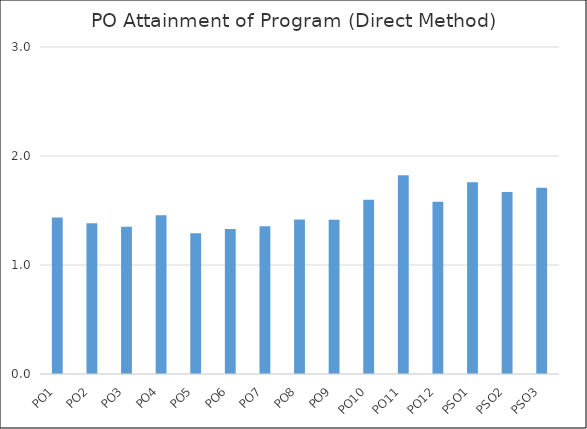
| Category | Series 0 |
|---|---|
| PO1 | 1.437 |
| PO2 | 1.383 |
| PO3 | 1.351 |
| PO4 | 1.455 |
| PO5 | 1.292 |
| PO6 | 1.329 |
| PO7 | 1.356 |
| PO8 | 1.417 |
| PO9 | 1.416 |
| PO10 | 1.598 |
| PO11 | 1.823 |
| PO12 | 1.581 |
| PSO1 | 1.758 |
| PSO2 | 1.669 |
| PSO3 | 1.709 |